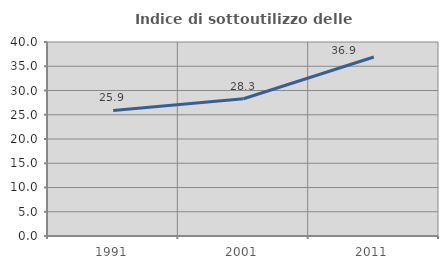
| Category | Indice di sottoutilizzo delle abitazioni  |
|---|---|
| 1991.0 | 25.883 |
| 2001.0 | 28.307 |
| 2011.0 | 36.907 |